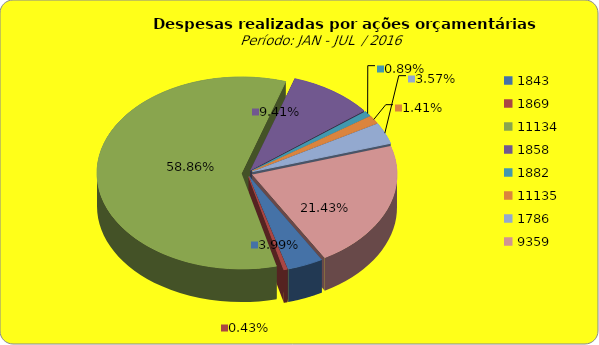
| Category | Series 1 |
|---|---|
| 1843.0 | 5874074.72 |
| 1869.0 | 627778.63 |
| 11134.0 | 86616758.98 |
| 1858.0 | 13852484.72 |
| 1882.0 | 1313981.16 |
| 11135.0 | 2073366.19 |
| 1786.0 | 5252262.82 |
| 9359.0 | 31538678.23 |